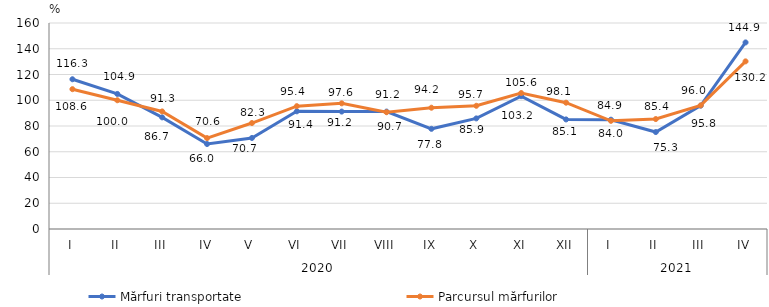
| Category | Mărfuri transportate | Parcursul mărfurilor |
|---|---|---|
| 0 | 116.3 | 108.6 |
| 1 | 104.9 | 100 |
| 2 | 86.7 | 91.3 |
| 3 | 66 | 70.6 |
| 4 | 70.7 | 82.3 |
| 5 | 91.4 | 95.4 |
| 6 | 91.2 | 97.6 |
| 7 | 91.2 | 90.7 |
| 8 | 77.8 | 94.2 |
| 9 | 85.9 | 95.7 |
| 10 | 103.2 | 105.6 |
| 11 | 85.1 | 98.1 |
| 12 | 84.9 | 84 |
| 13 | 75.3 | 85.4 |
| 14 | 95.8 | 96 |
| 15 | 144.9 | 130.2 |